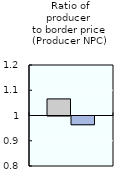
| Category | 2000-02 | 2016-18 |
|---|---|---|
| Ratio of producer 
to border price 
(Producer NPC) | 1.066 | 0.965 |